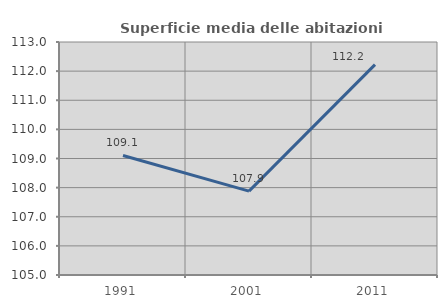
| Category | Superficie media delle abitazioni occupate |
|---|---|
| 1991.0 | 109.104 |
| 2001.0 | 107.878 |
| 2011.0 | 112.225 |